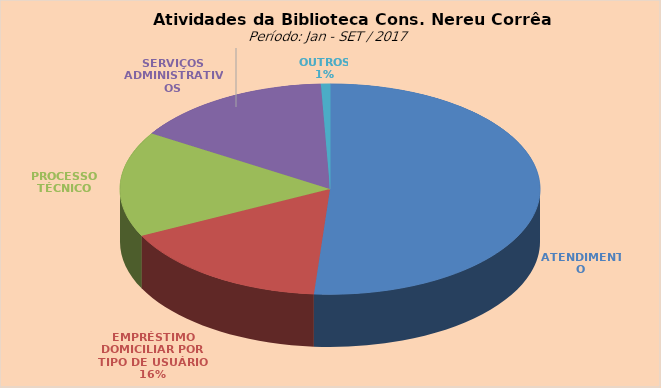
| Category | Series 0 |
|---|---|
| ATENDIMENTO | 10955 |
| EMPRÉSTIMO DOMICILIAR POR TIPO DE USUÁRIO | 3519 |
| PROCESSO TÉCNICO | 3466 |
| SERVIÇOS ADMINISTRATIVOS | 3299 |
| OUTROS | 149 |